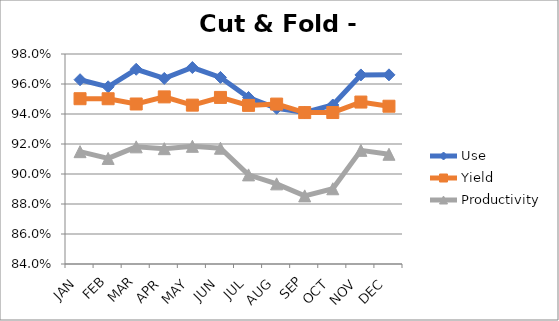
| Category | Use | Yield | Productivity |
|---|---|---|---|
| JAN | 0.963 | 0.95 | 0.915 |
| FEB | 0.958 | 0.95 | 0.91 |
| MAR | 0.97 | 0.947 | 0.918 |
| APR | 0.964 | 0.951 | 0.917 |
| MAY | 0.971 | 0.946 | 0.918 |
| JUN | 0.964 | 0.951 | 0.917 |
| JUL | 0.951 | 0.946 | 0.899 |
| AUG | 0.944 | 0.947 | 0.893 |
| SEP | 0.941 | 0.941 | 0.885 |
| OCT | 0.946 | 0.941 | 0.89 |
| NOV | 0.966 | 0.948 | 0.916 |
| DEC | 0.966 | 0.945 | 0.913 |